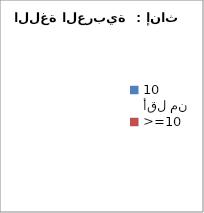
| Category | إناث |
|---|---|
| أقل من 10 | 0 |
| >=10 | 0 |